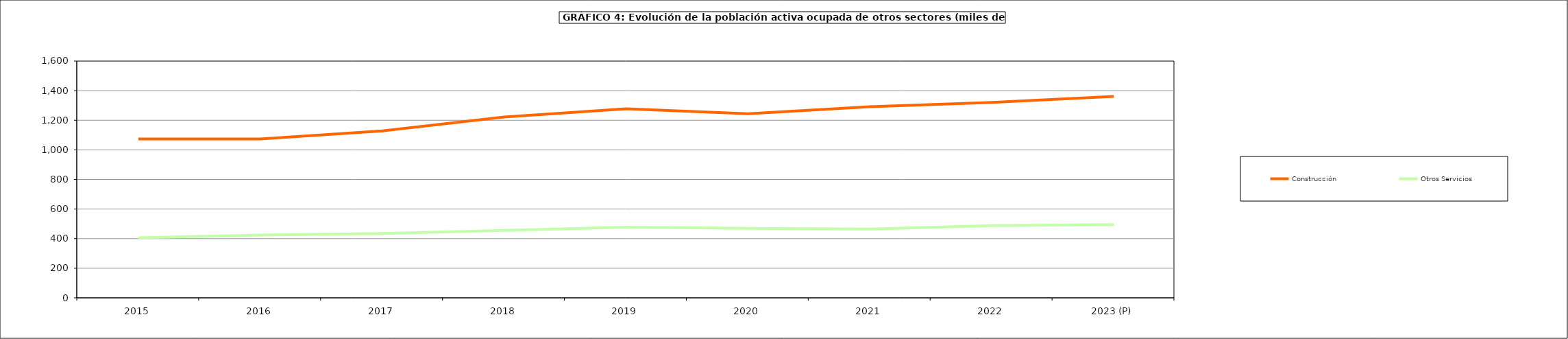
| Category | Construcción | Otros Servicios |
|---|---|---|
| 2015 | 1073.65 | 405.475 |
| 2016 | 1073.9 | 424.325 |
| 2017 | 1128.3 | 434.6 |
| 2018 | 1221.8 | 455.3 |
| 2019 | 1277.9 | 477.775 |
| 2020 | 1244.075 | 469.65 |
| 2021 | 1291.525 | 465.425 |
| 2022 | 1321.025 | 488.3 |
| 2023 (P) | 1361.175 | 495.3 |